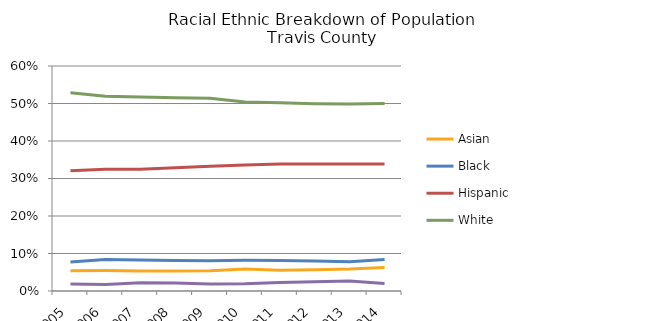
| Category | Asian | Black | Hispanic | White | Other Race or Two or More Races |
|---|---|---|---|---|---|
| 2005.0 | 0.054 | 0.077 | 0.321 | 0.529 | 0.019 |
| 2006.0 | 0.054 | 0.084 | 0.325 | 0.519 | 0.018 |
| 2007.0 | 0.053 | 0.082 | 0.325 | 0.517 | 0.022 |
| 2008.0 | 0.053 | 0.081 | 0.329 | 0.515 | 0.021 |
| 2009.0 | 0.054 | 0.081 | 0.333 | 0.514 | 0.019 |
| 2010.0 | 0.059 | 0.082 | 0.336 | 0.504 | 0.019 |
| 2011.0 | 0.055 | 0.082 | 0.339 | 0.502 | 0.023 |
| 2012.0 | 0.057 | 0.08 | 0.338 | 0.5 | 0.025 |
| 2013.0 | 0.058 | 0.078 | 0.338 | 0.499 | 0.026 |
| 2014.0 | 0.063 | 0.084 | 0.339 | 0.5 | 0.02 |